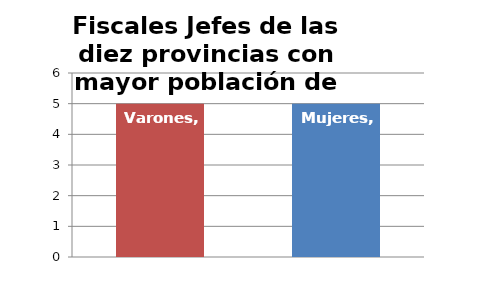
| Category | Fiscales Jefes de las diez provincias con mayor población de España |
|---|---|
| Varones | 5 |
| Mujeres | 5 |